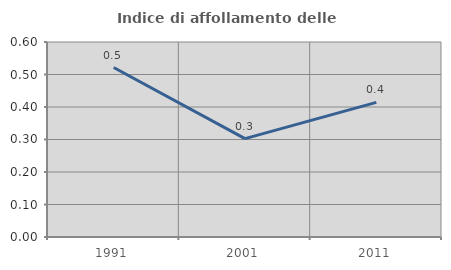
| Category | Indice di affollamento delle abitazioni  |
|---|---|
| 1991.0 | 0.522 |
| 2001.0 | 0.303 |
| 2011.0 | 0.414 |